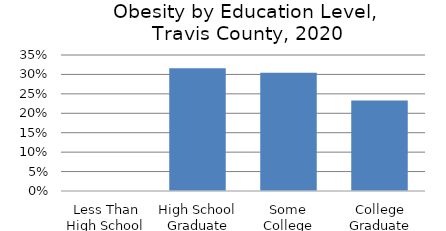
| Category | Series 0 |
|---|---|
| Less Than High School | 0 |
| High School Graduate | 0.316 |
| Some College | 0.304 |
| College Graduate | 0.233 |